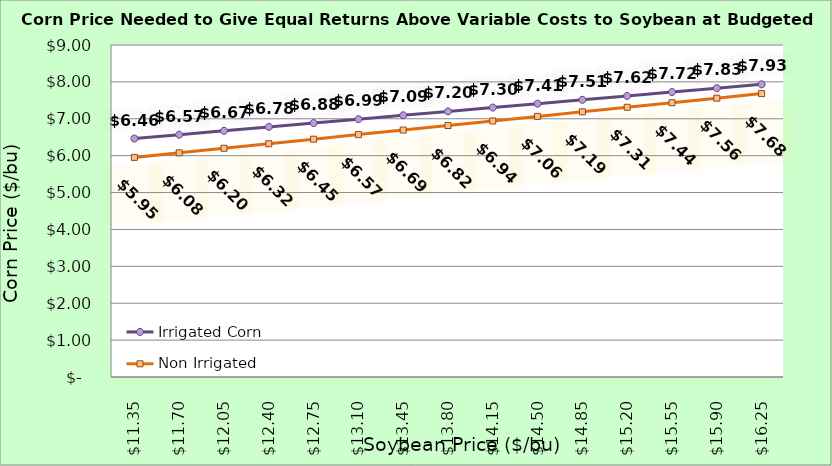
| Category | Irrigated Corn | Non Irrigated Corn |
|---|---|---|
| 11.350000000000003 | 6.464 | 5.953 |
| 11.700000000000003 | 6.569 | 6.077 |
| 12.050000000000002 | 6.674 | 6.2 |
| 12.400000000000002 | 6.779 | 6.324 |
| 12.750000000000002 | 6.884 | 6.447 |
| 13.100000000000001 | 6.989 | 6.571 |
| 13.450000000000001 | 7.094 | 6.694 |
| 13.8 | 7.199 | 6.818 |
| 14.15 | 7.304 | 6.941 |
| 14.5 | 7.409 | 7.065 |
| 14.85 | 7.514 | 7.188 |
| 15.2 | 7.619 | 7.312 |
| 15.549999999999999 | 7.724 | 7.435 |
| 15.899999999999999 | 7.829 | 7.559 |
| 16.25 | 7.934 | 7.682 |